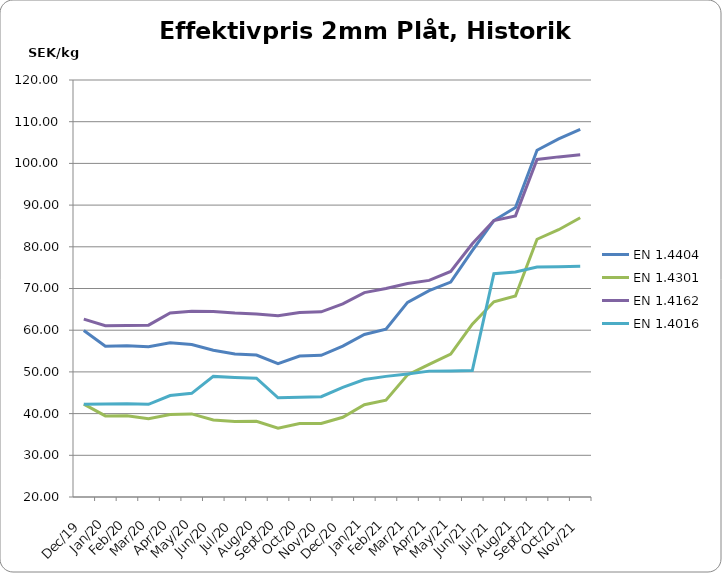
| Category | EN 1.4404 | EN 1.4301 | EN 1.4162  | EN 1.4016 |
|---|---|---|---|---|
| 2019-12-01 | 59.92 | 42.28 | 62.66 | 42.27 |
| 2020-01-01 | 56.17 | 39.44 | 61.09 | 42.3 |
| 2020-02-01 | 56.29 | 39.51 | 61.13 | 42.35 |
| 2020-03-01 | 56.011 | 38.762 | 61.207 | 42.238 |
| 2020-04-01 | 56.99 | 39.78 | 64.12 | 44.32 |
| 2020-05-01 | 56.561 | 39.922 | 64.555 | 44.865 |
| 2020-06-01 | 55.205 | 38.457 | 64.504 | 48.924 |
| 2020-07-01 | 54.28 | 38.09 | 64.1 | 48.67 |
| 2020-08-01 | 54.032 | 38.136 | 63.889 | 48.499 |
| 2020-09-01 | 51.982 | 36.492 | 63.459 | 43.787 |
| 2020-10-01 | 53.8 | 37.597 | 64.242 | 43.938 |
| 2020-11-01 | 53.982 | 37.627 | 64.412 | 44.061 |
| 2020-12-01 | 56.202 | 39.117 | 66.315 | 46.295 |
| 2021-01-01 | 58.983 | 42.129 | 69.024 | 48.184 |
| 2021-02-01 | 60.225 | 43.204 | 69.988 | 48.927 |
| 2021-03-01 | 66.669 | 49.29 | 71.179 | 49.506 |
| 2021-04-01 | 69.492 | 51.816 | 71.943 | 50.186 |
| 2021-05-01 | 71.536 | 54.26 | 74.099 | 50.223 |
| 2021-06-01 | 79.083 | 61.461 | 80.71 | 50.323 |
| 2021-07-01 | 86.292 | 66.826 | 86.308 | 73.542 |
| 2021-08-01 | 89.42 | 68.2 | 87.42 | 73.98 |
| 2021-09-01 | 103.148 | 81.81 | 100.943 | 75.172 |
| 2021-10-01 | 105.871 | 84.099 | 101.563 | 75.235 |
| 2021-11-01 | 108.169 | 86.954 | 102.06 | 75.332 |